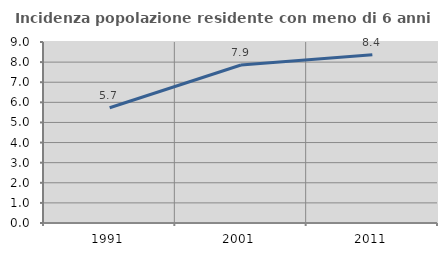
| Category | Incidenza popolazione residente con meno di 6 anni |
|---|---|
| 1991.0 | 5.732 |
| 2001.0 | 7.854 |
| 2011.0 | 8.362 |